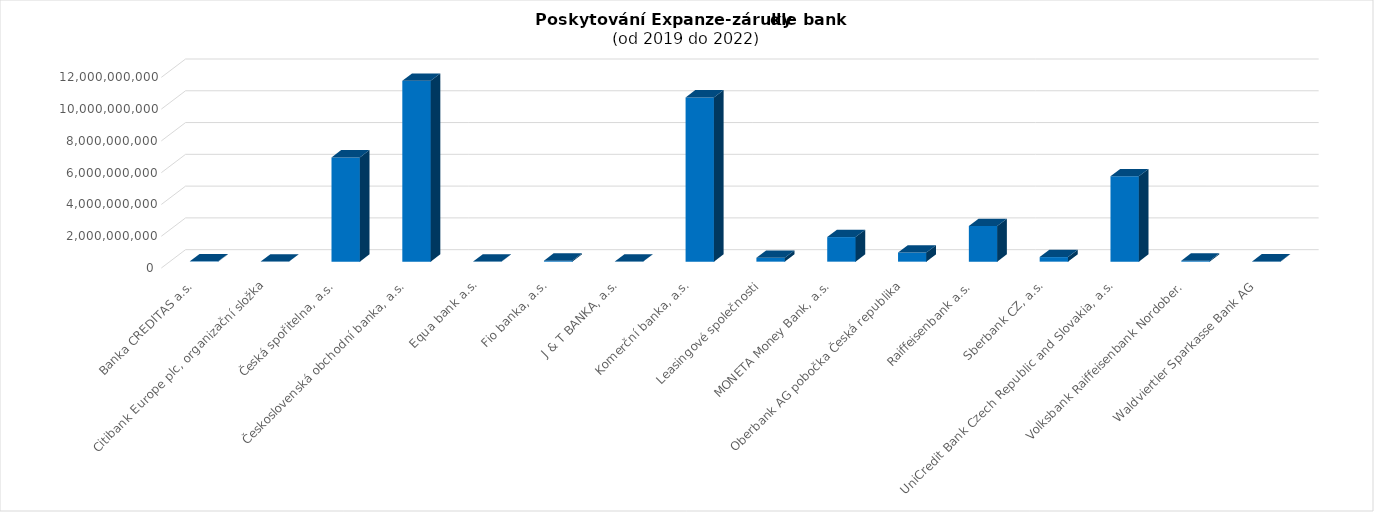
| Category | Series 0 |
|---|---|
| Banka CREDITAS a.s. | 18800000 |
| Citibank Europe plc, organizační složka | 8000000 |
| Česká spořitelna, a.s. | 6560262130.6 |
| Československá obchodní banka, a.s. | 11383260749 |
| Equa bank a.s. | 11920000 |
| Fio banka, a.s. | 61208800 |
| J & T BANKA, a.s. | 12000000 |
| Komerční banka, a.s. | 10339092981.35 |
| Leasingové společnosti | 244486674.92 |
| MONETA Money Bank, a.s. | 1546301558 |
| Oberbank AG pobočka Česká republika | 576298899 |
| Raiffeisenbank a.s. | 2237321957.84 |
| Sberbank CZ, a.s. | 287710832 |
| UniCredit Bank Czech Republic and Slovakia, a.s. | 5373431836 |
| Volksbank Raiffeisenbank Nordober. | 61799003 |
| Waldviertler Sparkasse Bank AG | 17309478 |